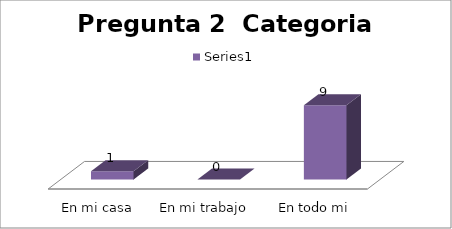
| Category | Series 0 |
|---|---|
| En mi casa  | 1 |
| En mi trabajo  | 0 |
| En todo mi entorno | 9 |